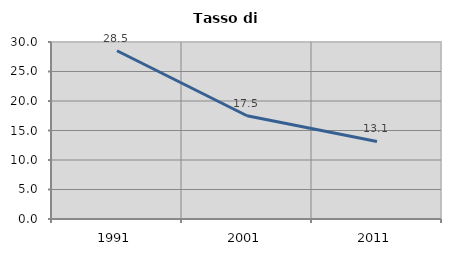
| Category | Tasso di disoccupazione   |
|---|---|
| 1991.0 | 28.519 |
| 2001.0 | 17.497 |
| 2011.0 | 13.15 |